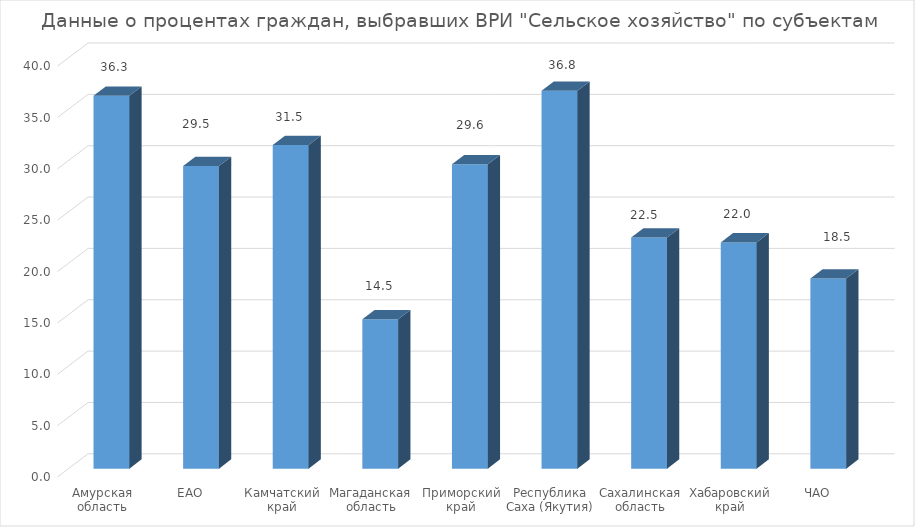
| Category | сельское хозяйство |
|---|---|
| Амурская область | 36.301 |
| ЕАО | 29.464 |
| Камчатский край | 31.51 |
| Магаданская область | 14.548 |
| Приморский край | 29.628 |
| Республика Саха (Якутия) | 36.788 |
| Сахалинская область | 22.494 |
| Хабаровский край | 22.029 |
| ЧАО | 18.504 |